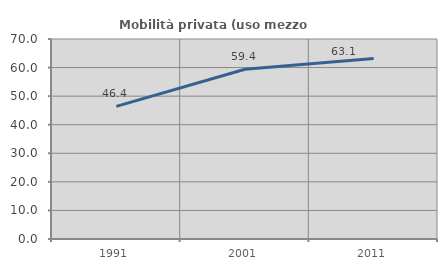
| Category | Mobilità privata (uso mezzo privato) |
|---|---|
| 1991.0 | 46.406 |
| 2001.0 | 59.426 |
| 2011.0 | 63.142 |